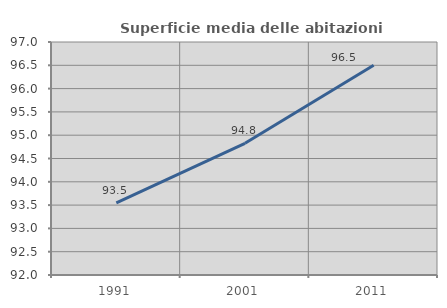
| Category | Superficie media delle abitazioni occupate |
|---|---|
| 1991.0 | 93.549 |
| 2001.0 | 94.826 |
| 2011.0 | 96.5 |